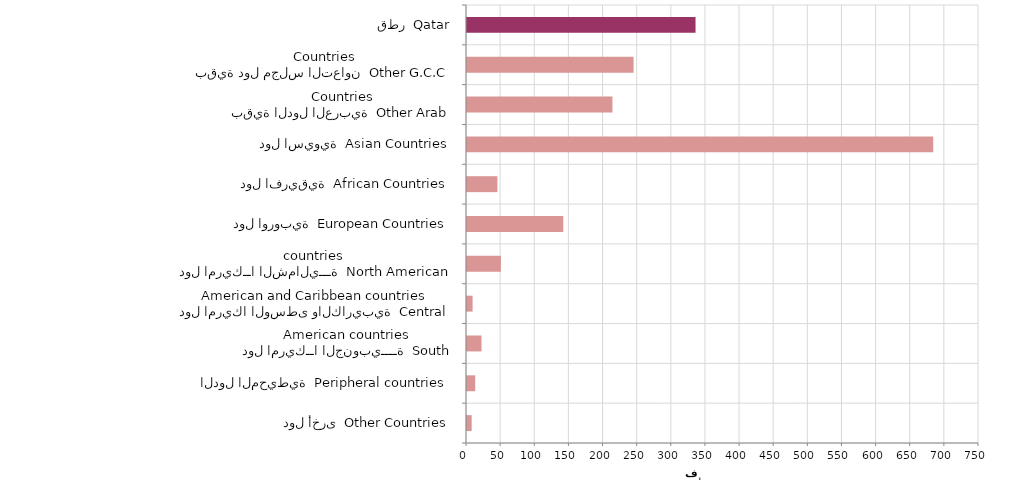
| Category | Series 0 |
|---|---|
| دول أخرى  Other Countries | 6827 |
| الدول المحيطية  Peripheral countries | 12022 |
| دول امريكــا الجنوبيــــة  South American countries | 21283 |
| دول امريكا الوسطى والكاريبية  Central American and Caribbean countries | 8193 |
| دول امريكــا الشماليـــة  North American countries  | 49647 |
| دول اوروبية  European Countries | 141043 |
| دول افريقية  African Countries | 44509 |
| دول اسيوية  Asian Countries | 682954 |
| بقية الدول العربية  Other Arab Countries | 213057 |
| بقية دول مجلس التعاون  Other G.C.C Countries | 243996 |
| قطر  Qatar | 334782 |